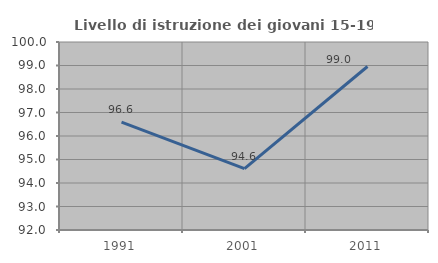
| Category | Livello di istruzione dei giovani 15-19 anni |
|---|---|
| 1991.0 | 96.591 |
| 2001.0 | 94.615 |
| 2011.0 | 98.958 |